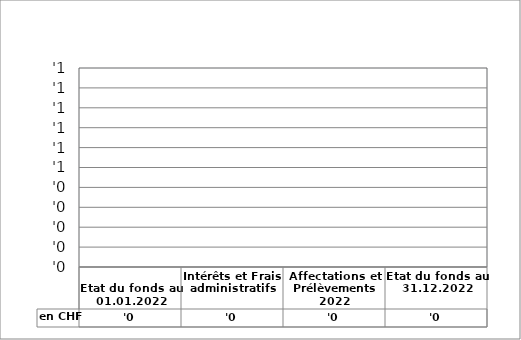
| Category | en CHF |
|---|---|
| 
Etat du fonds au 01.01.2022

 | 0 |
| Intérêts et Frais administratifs | 0 |
| Affectations et Prélèvements 2022 | 0 |
| Etat du fonds au 31.12.2022 | 0 |